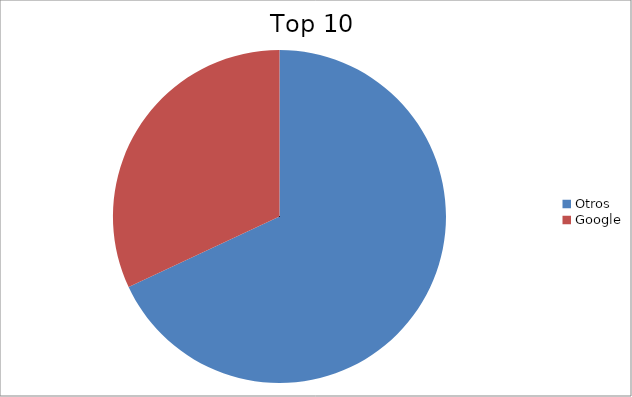
| Category | Series 0 |
|---|---|
| Otros | 68.05 |
| Google | 31.95 |